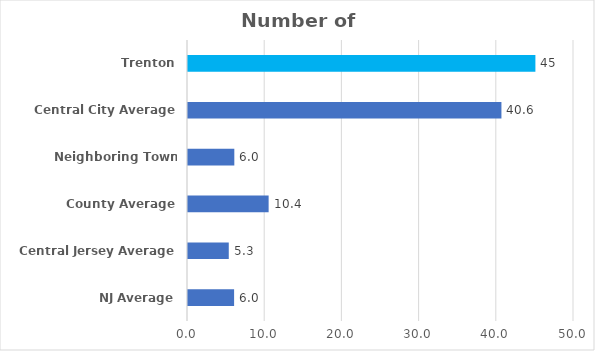
| Category | Number of PILOTs |
|---|---|
| NJ Average | 5.971 |
| Central Jersey Average | 5.281 |
| County Average | 10.444 |
| Neighboring Town Average | 6 |
| Central City Average | 40.6 |
| Trenton | 45 |